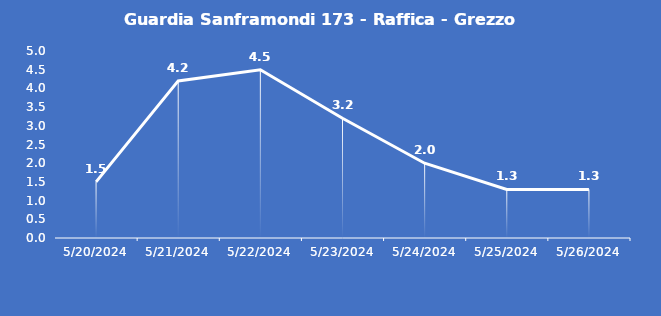
| Category | Guardia Sanframondi 173 - Raffica - Grezzo (m/s) |
|---|---|
| 5/20/24 | 1.5 |
| 5/21/24 | 4.2 |
| 5/22/24 | 4.5 |
| 5/23/24 | 3.2 |
| 5/24/24 | 2 |
| 5/25/24 | 1.3 |
| 5/26/24 | 1.3 |